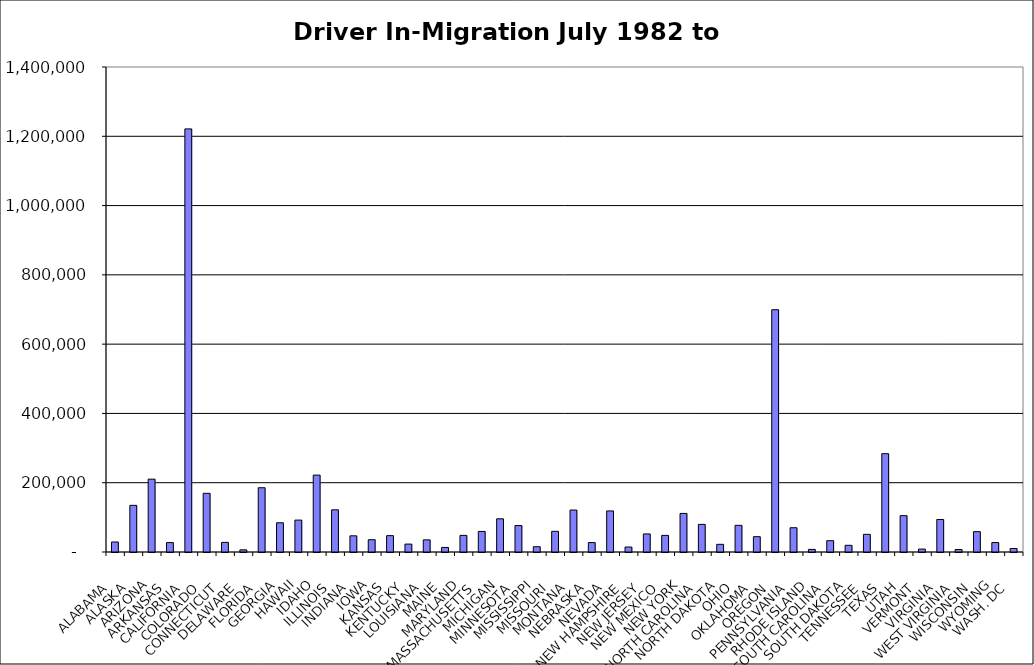
| Category | Series 0 |
|---|---|
|  ALABAMA  | 28871.5 |
|  ALASKA  | 134667.5 |
|  ARIZONA  | 210279 |
|  ARKANSAS  | 27168.5 |
|  CALIFORNIA  | 1221331.5 |
|  COLORADO  | 169428 |
|  CONNECTICUT  | 27810 |
|  DELAWARE  | 6184.5 |
|  FLORIDA  | 185510 |
|  GEORGIA  | 84404 |
|  HAWAII  | 92106.5 |
|  IDAHO  | 221953.5 |
|  ILLINOIS  | 121769.5 |
|  INDIANA  | 46712 |
|  IOWA  | 35476.5 |
|  KANSAS  | 47248.5 |
|  KENTUCKY  | 22867 |
|  LOUISIANA  | 35038.5 |
|  MAINE  | 13201.5 |
|  MARYLAND  | 47977 |
|  MASSACHUSETTS  | 59399 |
|  MICHIGAN  | 95837 |
|  MINNESOTA  | 76370.5 |
|  MISSISSIPPI  | 15227 |
|  MISSOURI  | 59677 |
|  MONTANA  | 121136 |
|  NEBRASKA  | 27159.5 |
|  NEVADA  | 118533 |
|  NEW HAMPSHIRE  | 14376.5 |
|  NEW JERSEY  | 52147 |
|  NEW MEXICO  | 47980 |
|  NEW YORK  | 111330 |
|  NORTH CAROLINA  | 79733.5 |
|  NORTH DAKOTA  | 22183.5 |
|  OHIO  | 76960.5 |
|  OKLAHOMA  | 44212 |
|  OREGON  | 699347 |
|  PENNSYLVANIA  | 70035.5 |
|  RHODE ISLAND  | 7565 |
|  SOUTH CAROLINA  | 32640.5 |
|  SOUTH DAKOTA  | 19333.5 |
|  TENNESSEE  | 50985.5 |
|  TEXAS  | 283803 |
|  UTAH  | 104911.5 |
|  VERMONT  | 8444 |
|  VIRGINIA  | 93883 |
|  WEST VIRGINIA  | 7124.5 |
|  WISCONSIN  | 58758.5 |
|  WYOMING  | 27254 |
|  WASH. DC  | 10064 |